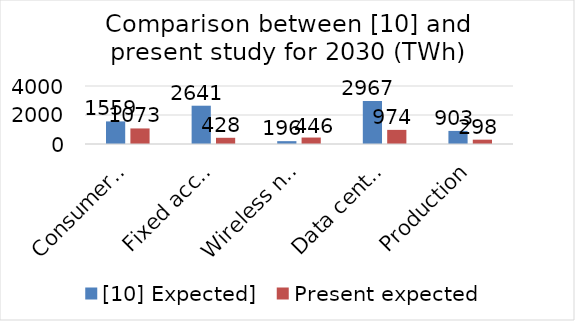
| Category | [10] Expected] | Present expected |
|---|---|---|
| Consumer devices use | 1558.538 | 1072.953 |
| Fixed access wired use | 2640.627 | 428.007 |
| Wireless networks access use | 196.045 | 445.627 |
| Data centers use | 2967.267 | 973.747 |
| Production | 902.568 | 298.038 |